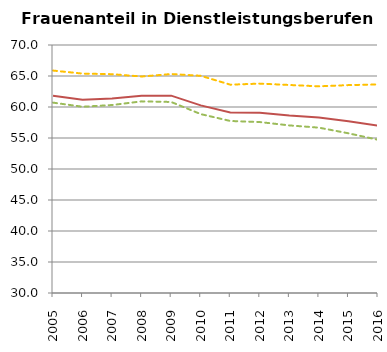
| Category | Produktionsberufe | Dienstleistungsberufe | davon: primäre DL-Berufe | davon: sekundäre DL-Berufe |
|---|---|---|---|---|
| 2005 | 6.493 | 61.829 | 60.706 | 65.877 |
| 2006 | 6.645 | 61.18 | 60.041 | 65.386 |
| 2007 | 6.909 | 61.376 | 60.319 | 65.294 |
| 2008 | 7.366 | 61.8 | 60.908 | 64.917 |
| 2009 | 7.512 | 61.83 | 60.813 | 65.317 |
| 2010 | 7.258 | 60.258 | 58.853 | 65.035 |
| 2011 | 7.058 | 59.114 | 57.747 | 63.604 |
| 2012 | 7.47 | 59.064 | 57.572 | 63.771 |
| 2013 | 7.544 | 58.624 | 57.03 | 63.551 |
| 2014 | 7.908 | 58.32 | 56.67 | 63.336 |
| 2015 | 7.991 | 57.719 | 55.758 | 63.53 |
| 2016 | 8.269 | 56.992 | 54.713 | 63.64 |